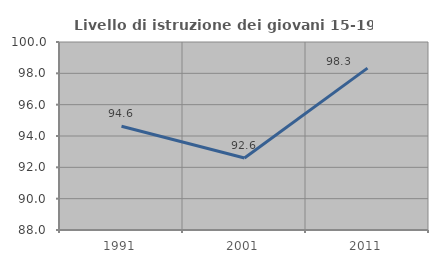
| Category | Livello di istruzione dei giovani 15-19 anni |
|---|---|
| 1991.0 | 94.624 |
| 2001.0 | 92.593 |
| 2011.0 | 98.333 |